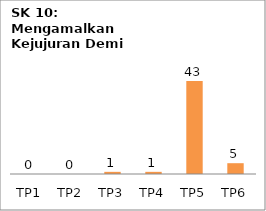
| Category | Bil Pel |
|---|---|
| TP1 | 0 |
| TP2 | 0 |
| TP3 | 1 |
| TP4 | 1 |
| TP5 | 43 |
| TP6 | 5 |